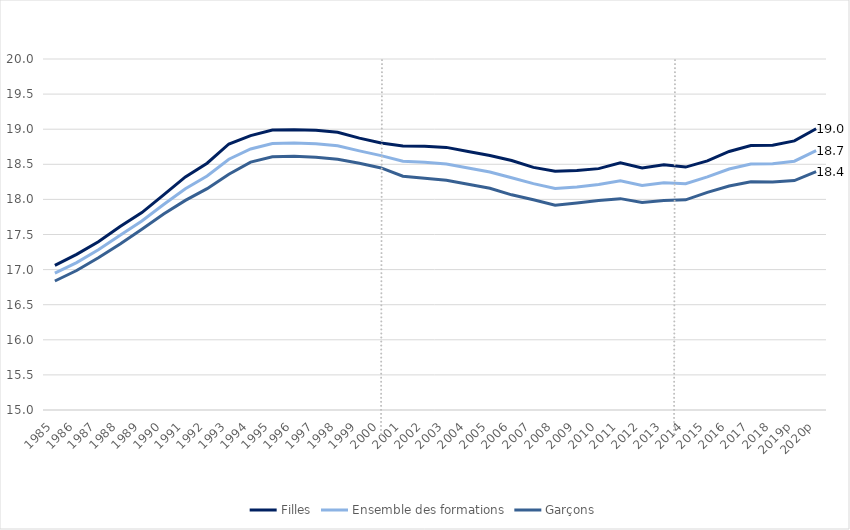
| Category | Filles | Ensemble des formations | Garçons |
|---|---|---|---|
| 1985 | 17.061 | 16.949 | 16.838 |
| 1986 | 17.217 | 17.1 | 16.987 |
| 1987 | 17.397 | 17.282 | 17.17 |
| 1988 | 17.614 | 17.488 | 17.366 |
| 1989 | 17.813 | 17.692 | 17.575 |
| 1990 | 18.065 | 17.927 | 17.793 |
| 1991 | 18.32 | 18.151 | 17.986 |
| 1992 | 18.515 | 18.333 | 18.153 |
| 1993 | 18.789 | 18.572 | 18.359 |
| 1994 | 18.908 | 18.718 | 18.531 |
| 1995 | 18.99 | 18.797 | 18.607 |
| 1996 | 18.992 | 18.805 | 18.615 |
| 1997 | 18.985 | 18.792 | 18.602 |
| 1998 | 18.955 | 18.764 | 18.571 |
| 1999 | 18.873 | 18.692 | 18.514 |
| 2000 | 18.803 | 18.624 | 18.448 |
| 2001 | 18.759 | 18.543 | 18.33 |
| 2002 | 18.758 | 18.528 | 18.301 |
| 2003 | 18.741 | 18.505 | 18.272 |
| 2004 | 18.682 | 18.448 | 18.216 |
| 2005 | 18.625 | 18.39 | 18.159 |
| 2006 | 18.555 | 18.308 | 18.065 |
| 2007 | 18.456 | 18.224 | 17.994 |
| 2008 | 18.401 | 18.157 | 17.918 |
| 2009 | 18.41 | 18.177 | 17.949 |
| 2010 | 18.438 | 18.213 | 17.986 |
| 2011 | 18.521 | 18.264 | 18.011 |
| 2012 | 18.449 | 18.2 | 17.958 |
| 2013 | 18.495 | 18.236 | 17.983 |
| 2014 | 18.46 | 18.224 | 17.994 |
| 2015 | 18.549 | 18.321 | 18.099 |
| 2016 | 18.683 | 18.433 | 18.191 |
| 2017 | 18.767 | 18.505 | 18.251 |
| 2018 | 18.771 | 18.507 | 18.248 |
| 2019p | 18.834 | 18.544 | 18.268 |
| 2020p | 19.006 | 18.694 | 18.395 |